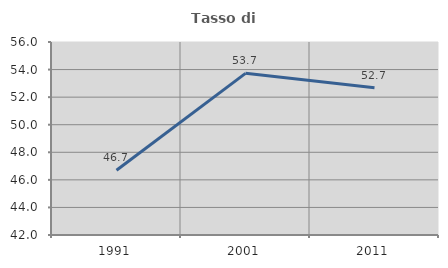
| Category | Tasso di occupazione   |
|---|---|
| 1991.0 | 46.696 |
| 2001.0 | 53.725 |
| 2011.0 | 52.685 |